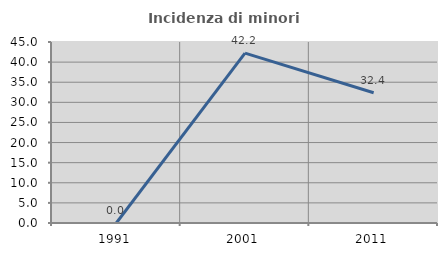
| Category | Incidenza di minori stranieri |
|---|---|
| 1991.0 | 0 |
| 2001.0 | 42.222 |
| 2011.0 | 32.394 |